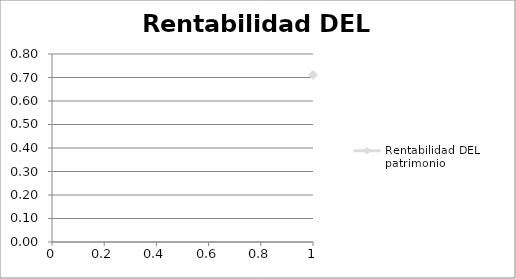
| Category | Rentabilidad DEL patrimonio |
|---|---|
| 0 | 0.711 |
| 1 | 0.293 |
| 2 | 0.334 |
| 3 | 0.251 |
| 4 | 0.204 |
| 5 | 0.17 |
| 6 | 0.145 |
| 7 | 0.128 |